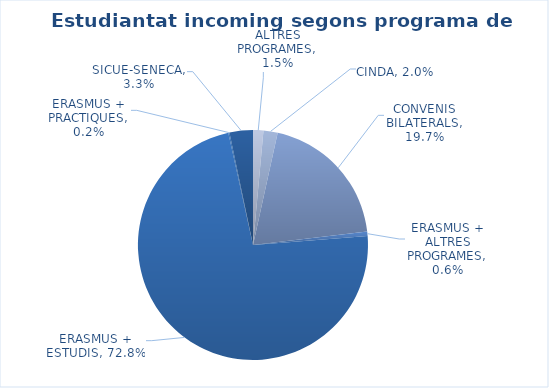
| Category | % Estudiants incoming |
|---|---|
| ALTRES PROGRAMES | 0.015 |
| CINDA | 0.02 |
| CONVENIS BILATERALS | 0.197 |
| ERASMUS + ALTRES PROGRAMES | 0.006 |
| ERASMUS + ESTUDIS | 0.728 |
| ERASMUS + PRACTIQUES | 0.002 |
| SICUE-SENECA | 0.033 |